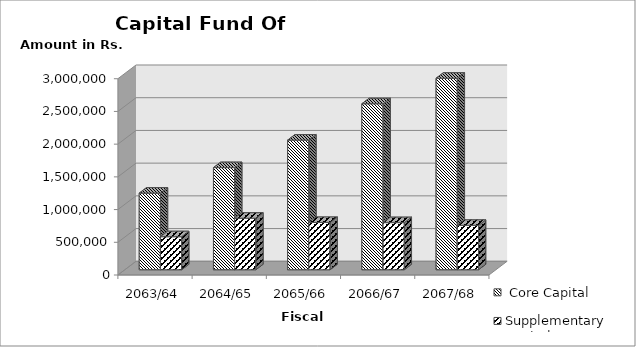
| Category |  Core Capital | Supplementary Capital |
|---|---|---|
| 2063/64 | 1171133 | 504982 |
| 2064/65 | 1560859 | 787531 |
| 2065/66 | 1981579 | 722291 |
| 2066/67 | 2537092 | 720049 |
| 2067/68 | 2927168 | 678673 |